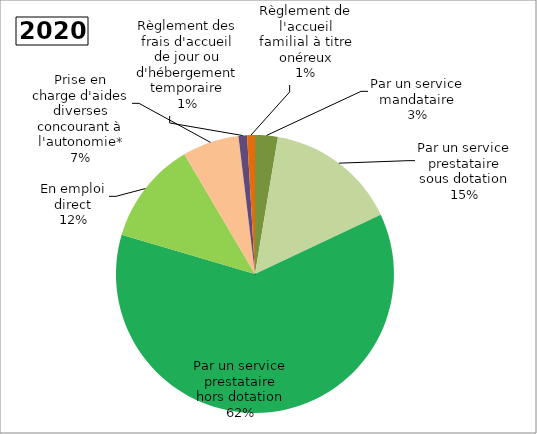
| Category | Series 0 |
|---|---|
| Par un service mandataire | 0.026 |
| Par un service prestataire sous dotation | 0.153 |
| Par un service prestataire hors dotation | 0.616 |
| En emploi direct | 0.12 |
| Prise en charge d'aides diverses concourant à l'autonomie* | 0.066 |
| Règlement des frais d'accueil de jour ou d'hébergement temporaire | 0.01 |
| Règlement de l'accueil familial à titre onéreux | 0.009 |